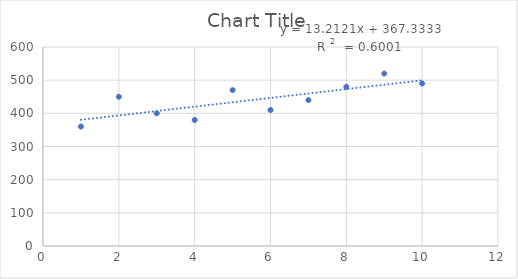
| Category | Series 0 |
|---|---|
| 1.0 | 360 |
| 2.0 | 450 |
| 3.0 | 400 |
| 4.0 | 380 |
| 5.0 | 470 |
| 6.0 | 410 |
| 7.0 | 440 |
| 8.0 | 480 |
| 9.0 | 520 |
| 10.0 | 490 |